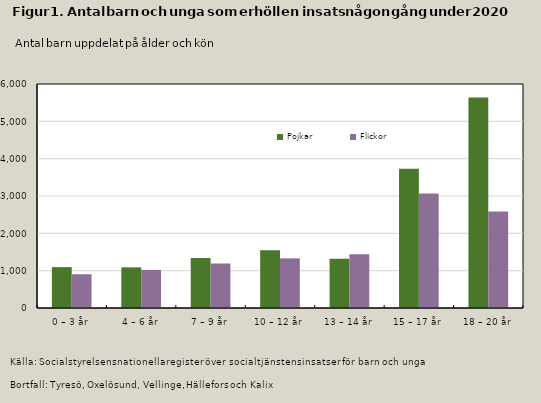
| Category | Pojkar | Flickor |
|---|---|---|
| 0 – 3 år | 1095 | 904 |
| 4 – 6 år | 1089 | 1020 |
| 7 – 9 år | 1336 | 1189 |
| 10 – 12 år | 1545 | 1330 |
| 13 – 14 år | 1319 | 1441 |
| 15 – 17 år | 3729 | 3069 |
| 18 – 20 år | 5641 | 2588 |